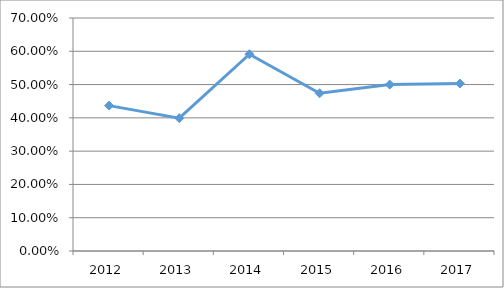
| Category | FOAU-F4O07 |
|---|---|
| 2012.0 | 0.437 |
| 2013.0 | 0.399 |
| 2014.0 | 0.591 |
| 2015.0 | 0.474 |
| 2016.0 | 0.5 |
| 2017.0 | 0.503 |